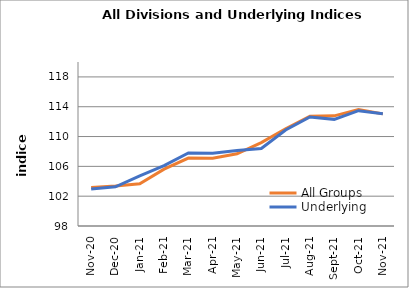
| Category | All Groups | Underlying |
|---|---|---|
| 2020-11-01 | 103.171 | 102.969 |
| 2020-12-01 | 103.378 | 103.266 |
| 2021-01-01 | 103.671 | 104.733 |
| 2021-02-01 | 105.627 | 106.099 |
| 2021-03-01 | 107.11 | 107.788 |
| 2021-04-01 | 107.082 | 107.772 |
| 2021-05-01 | 107.693 | 108.128 |
| 2021-06-01 | 109.193 | 108.399 |
| 2021-07-01 | 111.039 | 110.883 |
| 2021-08-01 | 112.735 | 112.633 |
| 2021-09-01 | 112.778 | 112.306 |
| 2021-10-01 | 113.609 | 113.469 |
| 2021-11-01 | 113.04 | 113.069 |